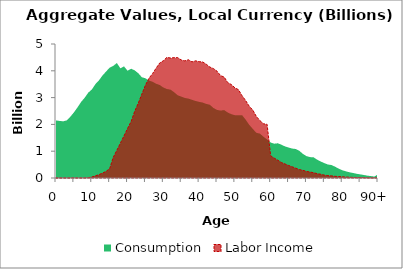
| Category | Consumption | Labor Income |
|---|---|---|
| 0 | 2148.994 | 0 |
|  | 2129.723 | 0 |
| 2 | 2114.816 | 0 |
| 3 | 2149.453 | 0 |
| 4 | 2286.292 | 0 |
| 5 | 2447.077 | 0 |
| 6 | 2633.201 | 0 |
| 7 | 2835.347 | 0 |
| 8 | 2991.633 | 0 |
| 9 | 3181.977 | 9.629 |
| 10 | 3301.342 | 36.468 |
| 11 | 3500.687 | 81.15 |
| 12 | 3643.227 | 125.067 |
| 13 | 3825.567 | 183.248 |
| 14 | 3973.178 | 248.311 |
| 15 | 4118.642 | 348.948 |
| 16 | 4182.898 | 768.74 |
| 17 | 4290.156 | 1032.71 |
| 18 | 4092.561 | 1300.338 |
| 19 | 4164.64 | 1570.606 |
| 20 | 4004.015 | 1847.581 |
| 21 | 4076.959 | 2108.637 |
| 22 | 4016.07 | 2488.225 |
| 23 | 3909.939 | 2794.651 |
| 24 | 3759.514 | 3132.015 |
| 25 | 3721.175 | 3464.575 |
| 26 | 3637.344 | 3724.022 |
| 27 | 3589.971 | 3896.822 |
| 28 | 3517.647 | 4102.363 |
| 29 | 3469.255 | 4293.06 |
| 30 | 3378.161 | 4374.976 |
| 31 | 3320.549 | 4501.648 |
| 32 | 3297.716 | 4477.216 |
| 33 | 3201.877 | 4489.877 |
| 34 | 3089.576 | 4492.468 |
| 35 | 3037.079 | 4405.192 |
| 36 | 2988.132 | 4370.029 |
| 37 | 2962.345 | 4412.494 |
| 38 | 2919.499 | 4332.886 |
| 39 | 2874.125 | 4372.452 |
| 40 | 2840.674 | 4340.173 |
| 41 | 2815.616 | 4330.072 |
| 42 | 2764.639 | 4245.175 |
| 43 | 2733.738 | 4139.485 |
| 44 | 2612.657 | 4082.928 |
| 45 | 2542.378 | 3985.764 |
| 46 | 2514.612 | 3819.829 |
| 47 | 2534.737 | 3766.284 |
| 48 | 2444.816 | 3560.533 |
| 49 | 2380.961 | 3487.29 |
| 50 | 2344.505 | 3366.101 |
| 51 | 2341.471 | 3295.215 |
| 52 | 2345.243 | 3072.533 |
| 53 | 2178.839 | 2891.652 |
| 54 | 1985.827 | 2680.49 |
| 55 | 1833.394 | 2535.145 |
| 56 | 1686.07 | 2297.658 |
| 57 | 1655.446 | 2140.939 |
| 58 | 1539.826 | 2024.066 |
| 59 | 1439.247 | 2002.403 |
| 60 | 1324.981 | 828.795 |
| 61 | 1280.673 | 741.892 |
| 62 | 1295.234 | 664.506 |
| 63 | 1244.022 | 577.751 |
| 64 | 1178.397 | 522.78 |
| 65 | 1137.147 | 469.094 |
| 66 | 1099.532 | 418.186 |
| 67 | 1082.081 | 368.409 |
| 68 | 1016.354 | 315.036 |
| 69 | 900.721 | 287.526 |
| 70 | 817.339 | 245.457 |
| 71 | 779.899 | 223.476 |
| 72 | 770.36 | 197.356 |
| 73 | 684.836 | 163.317 |
| 74 | 615.795 | 138.762 |
| 75 | 555.545 | 107.44 |
| 76 | 503.075 | 89.875 |
| 77 | 484.173 | 80.48 |
| 78 | 422.179 | 62.159 |
| 79 | 349.746 | 56.587 |
| 80 | 290.695 | 45.291 |
| 81 | 249.95 | 35.2 |
| 82 | 214.211 | 28.458 |
| 83 | 187.79 | 23.197 |
| 84 | 159.212 | 18.277 |
| 85 | 135.363 | 16.524 |
| 86 | 113.244 | 13.678 |
| 87 | 88.39 | 6.815 |
| 88 | 71.354 | 4.227 |
| 89 | 52.911 | 2.807 |
| 90+ | 139.232 | 6.402 |